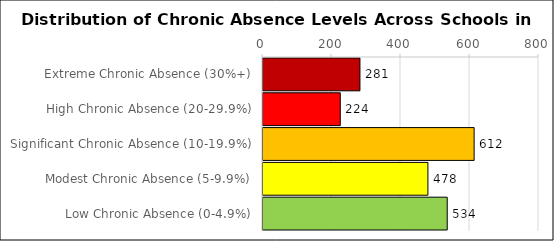
| Category | Number of Schools |
|---|---|
| Extreme Chronic Absence (30%+) | 281 |
| High Chronic Absence (20-29.9%) | 224 |
| Significant Chronic Absence (10-19.9%) | 612 |
| Modest Chronic Absence (5-9.9%) | 478 |
| Low Chronic Absence (0-4.9%) | 534 |